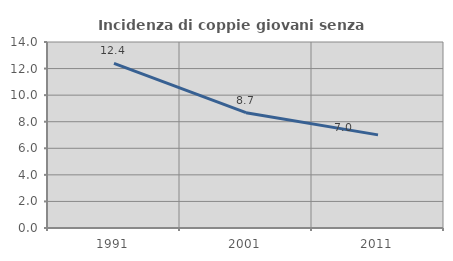
| Category | Incidenza di coppie giovani senza figli |
|---|---|
| 1991.0 | 12.386 |
| 2001.0 | 8.679 |
| 2011.0 | 7.009 |